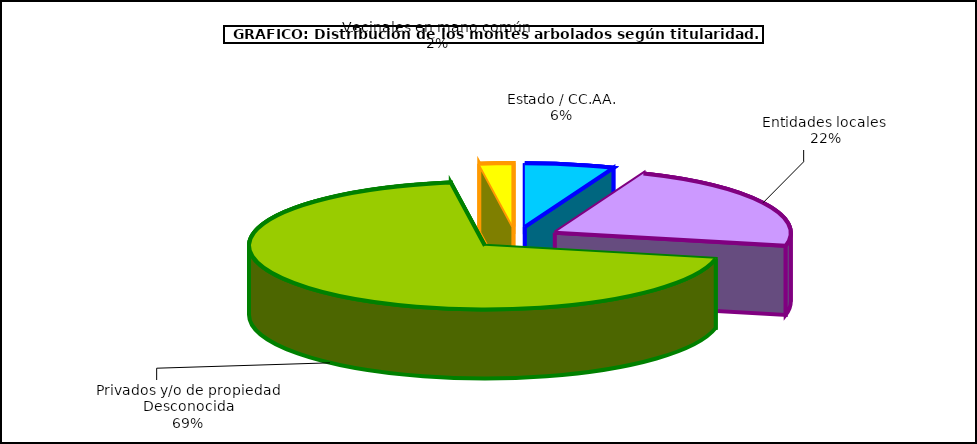
| Category | Series 0 |
|---|---|
| Estado / CC.AA. | 1136805.06 |
| Entidades locales  | 4114825.51 |
| Privados y/o de propiedad Desconocida | 12876926.163 |
| Vecinales en mano común  | 428471.925 |